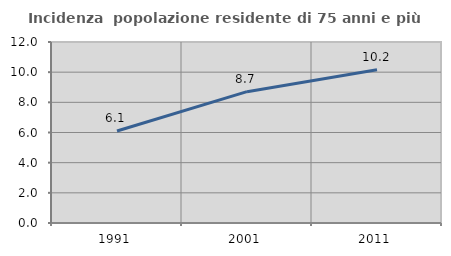
| Category | Incidenza  popolazione residente di 75 anni e più |
|---|---|
| 1991.0 | 6.1 |
| 2001.0 | 8.708 |
| 2011.0 | 10.166 |